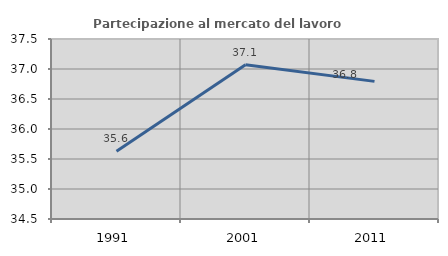
| Category | Partecipazione al mercato del lavoro  femminile |
|---|---|
| 1991.0 | 35.629 |
| 2001.0 | 37.07 |
| 2011.0 | 36.794 |